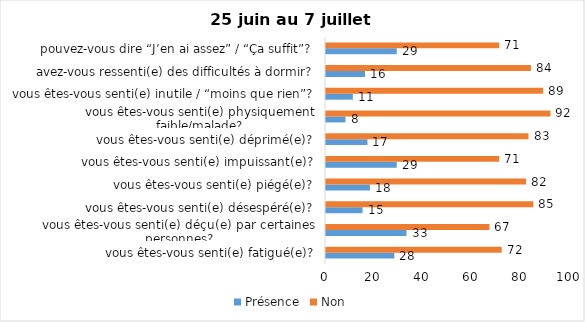
| Category | Présence | Non |
|---|---|---|
| vous êtes-vous senti(e) fatigué(e)? | 28 | 72 |
| vous êtes-vous senti(e) déçu(e) par certaines personnes? | 33 | 67 |
| vous êtes-vous senti(e) désespéré(e)? | 15 | 85 |
| vous êtes-vous senti(e) piégé(e)? | 18 | 82 |
| vous êtes-vous senti(e) impuissant(e)? | 29 | 71 |
| vous êtes-vous senti(e) déprimé(e)? | 17 | 83 |
| vous êtes-vous senti(e) physiquement faible/malade? | 8 | 92 |
| vous êtes-vous senti(e) inutile / “moins que rien”? | 11 | 89 |
| avez-vous ressenti(e) des difficultés à dormir? | 16 | 84 |
| pouvez-vous dire “J’en ai assez” / “Ça suffit”? | 29 | 71 |